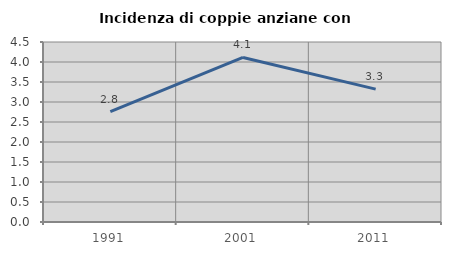
| Category | Incidenza di coppie anziane con figli |
|---|---|
| 1991.0 | 2.761 |
| 2001.0 | 4.114 |
| 2011.0 | 3.321 |